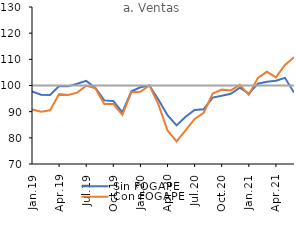
| Category | Sin FOGAPE | Con FOGAPE | Series 2 |
|---|---|---|---|
| 2019-01-01 | 97.763 | 90.879 | 100 |
| 2019-02-01 | 96.495 | 89.952 | 100 |
| 2019-03-01 | 96.37 | 90.544 | 100 |
| 2019-04-01 | 99.784 | 96.74 | 100 |
| 2019-05-01 | 99.67 | 96.398 | 100 |
| 2019-06-01 | 100.644 | 97.279 | 100 |
| 2019-07-01 | 101.764 | 99.944 | 100 |
| 2019-08-01 | 99.19 | 98.973 | 100 |
| 2019-09-01 | 94.308 | 92.929 | 100 |
| 2019-10-01 | 94.094 | 92.975 | 100 |
| 2019-11-01 | 89.705 | 88.787 | 100 |
| 2019-12-01 | 97.803 | 97.458 | 100 |
| 2020-01-01 | 99.343 | 97.621 | 100 |
| 2020-02-01 | 100 | 100 | 100 |
| 2020-03-01 | 94.577 | 92.68 | 100 |
| 2020-04-01 | 88.648 | 82.816 | 100 |
| 2020-05-01 | 84.763 | 78.672 | 100 |
| 2020-06-01 | 88.091 | 82.875 | 100 |
| 2020-07-01 | 90.676 | 87.206 | 100 |
| 2020-08-01 | 90.939 | 89.572 | 100 |
| 2020-09-01 | 95.377 | 96.932 | 100 |
| 2020-10-01 | 96.104 | 98.419 | 100 |
| 2020-11-01 | 96.861 | 98.119 | 100 |
| 2020-12-01 | 99.202 | 100.236 | 100 |
| 2021-01-01 | 96.9 | 96.438 | 100 |
| 2021-02-01 | 100.696 | 102.908 | 100 |
| 2021-03-01 | 101.427 | 105.235 | 100 |
| 2021-04-01 | 101.792 | 103.091 | 100 |
| 2021-05-01 | 102.926 | 107.868 | 100 |
| 2021-06-01 | 97.306 | 110.778 | 100 |